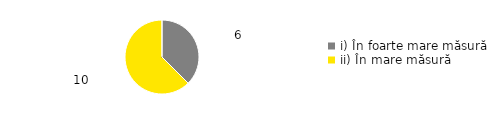
| Category | Total |
|---|---|
| i) În foarte mare măsură | 0.375 |
| ii) În mare măsură | 0.625 |